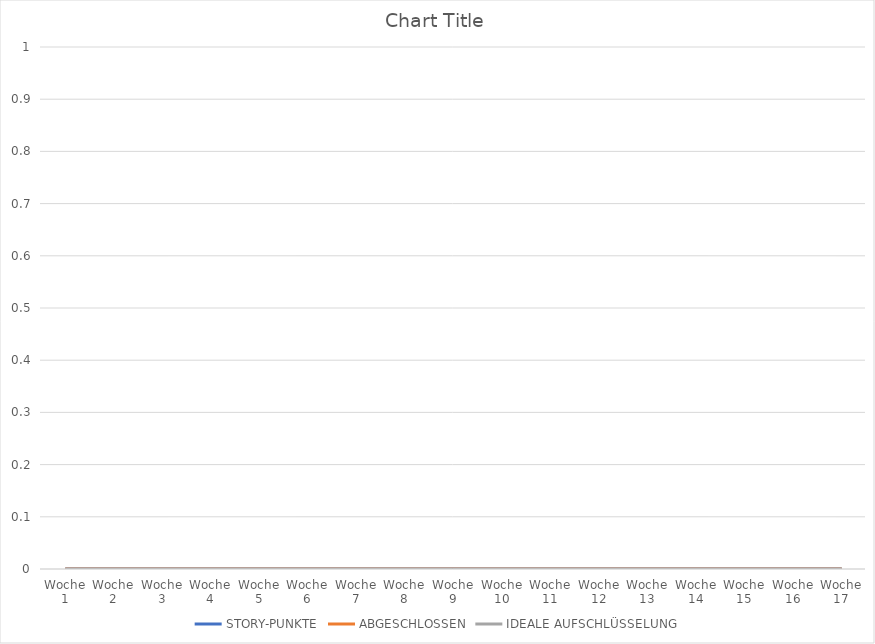
| Category | STORY-PUNKTE | ABGESCHLOSSEN | IDEALE AUFSCHLÜSSELUNG |
|---|---|---|---|
| Woche 1 | 0 | 0 | 0 |
| Woche 2 | 0 | 0 | 0 |
| Woche 3 | 0 | 0 | 0 |
| Woche 4 | 0 | 0 | 0 |
| Woche 5 | 0 | 0 | 0 |
| Woche 6 | 0 | 0 | 0 |
| Woche 7 | 0 | 0 | 0 |
| Woche 8 | 0 | 0 | 0 |
| Woche 9 | 0 | 0 | 0 |
| Woche 10 | 0 | 0 | 0 |
| Woche 11 | 0 | 0 | 0 |
| Woche 12 | 0 | 0 | 0 |
| Woche 13 | 0 | 0 | 0 |
| Woche 14 | 0 | 0 | 0 |
| Woche 15 | 0 | 0 | 0 |
| Woche 16 | 0 | 0 | 0 |
| Woche 17 | 0 | 0 | 0 |